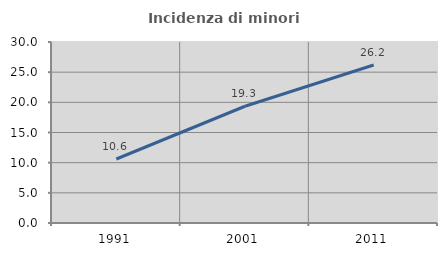
| Category | Incidenza di minori stranieri |
|---|---|
| 1991.0 | 10.606 |
| 2001.0 | 19.349 |
| 2011.0 | 26.186 |